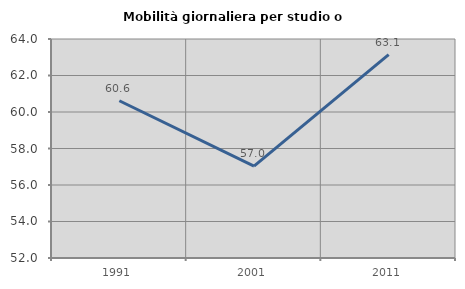
| Category | Mobilità giornaliera per studio o lavoro |
|---|---|
| 1991.0 | 60.617 |
| 2001.0 | 57.03 |
| 2011.0 | 63.147 |